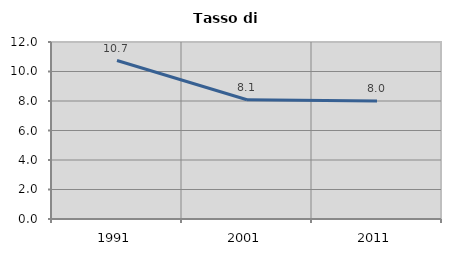
| Category | Tasso di disoccupazione   |
|---|---|
| 1991.0 | 10.744 |
| 2001.0 | 8.084 |
| 2011.0 | 8.003 |